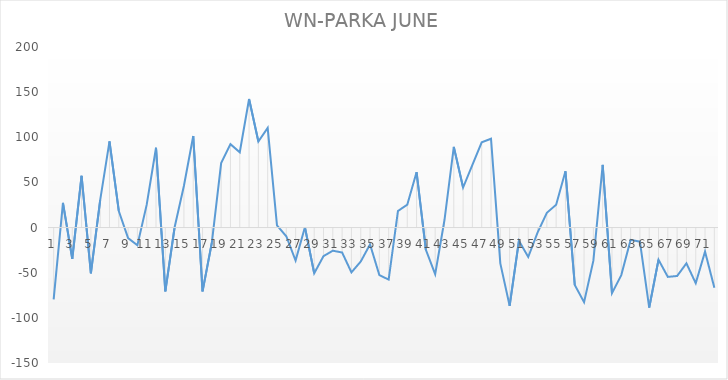
| Category | WN |
|---|---|
| 0 | -79.625 |
| 1 | 27.375 |
| 2 | -34.625 |
| 3 | 57.375 |
| 4 | -50.625 |
| 5 | 30.375 |
| 6 | 95.375 |
| 7 | 18.375 |
| 8 | -11.625 |
| 9 | -19.625 |
| 10 | 25.375 |
| 11 | 88.375 |
| 12 | -70.625 |
| 13 | 0.375 |
| 14 | 46.375 |
| 15 | 101.375 |
| 16 | -70.625 |
| 17 | -16.625 |
| 18 | 71.375 |
| 19 | 92.375 |
| 20 | 83.375 |
| 21 | 142.375 |
| 22 | 95.375 |
| 23 | 110.375 |
| 24 | 2.375 |
| 25 | -9.625 |
| 26 | -36.625 |
| 27 | 0.375 |
| 28 | -50.625 |
| 29 | -31.625 |
| 30 | -25.625 |
| 31 | -27.625 |
| 32 | -49.625 |
| 33 | -37.625 |
| 34 | -18.625 |
| 35 | -52.625 |
| 36 | -57.625 |
| 37 | 18.375 |
| 38 | 25.375 |
| 39 | 61.375 |
| 40 | -24.625 |
| 41 | -51.625 |
| 42 | 8.375 |
| 43 | 89.375 |
| 44 | 44.375 |
| 45 | 69.375 |
| 46 | 94.375 |
| 47 | 98.375 |
| 48 | -39.625 |
| 49 | -86.625 |
| 50 | -14.625 |
| 51 | -32.625 |
| 52 | -5.625 |
| 53 | 16.375 |
| 54 | 25.375 |
| 55 | 62.375 |
| 56 | -63.625 |
| 57 | -82.625 |
| 58 | -36.625 |
| 59 | 69.375 |
| 60 | -72.625 |
| 61 | -52.625 |
| 62 | -13.625 |
| 63 | -15.625 |
| 64 | -88.625 |
| 65 | -35.625 |
| 66 | -54.625 |
| 67 | -53.625 |
| 68 | -39.625 |
| 69 | -61.625 |
| 70 | -26.625 |
| 71 | -66.625 |